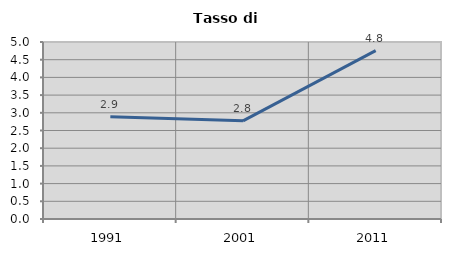
| Category | Tasso di disoccupazione   |
|---|---|
| 1991.0 | 2.891 |
| 2001.0 | 2.773 |
| 2011.0 | 4.758 |